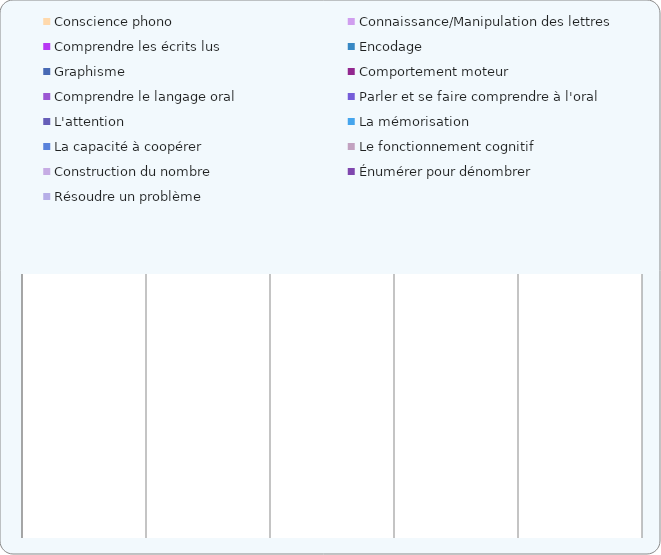
| Category | Conscience phono | Connaissance/Manipulation des lettres | Comprendre les écrits lus | Encodage  | Graphisme | Comportement moteur | Comprendre le langage oral | Parler et se faire comprendre à l'oral | L'attention | La mémorisation | La capacité à coopérer | Le fonctionnement cognitif | Construction du nombre | Énumérer pour dénombrer | Résoudre un problème |
|---|---|---|---|---|---|---|---|---|---|---|---|---|---|---|---|
|  | 0 | 0 | 0 | 0 | 0 | 0 | 0 | 0 | 0 | 0 | 0 | 0 | 0 | 0 | 0 |